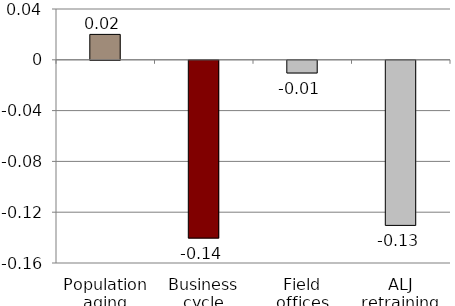
| Category | Series 0 |
|---|---|
| Population aging | 0.02 |
| Business cycle | -0.14 |
| Field offices | -0.01 |
| ALJ retraining | -0.13 |